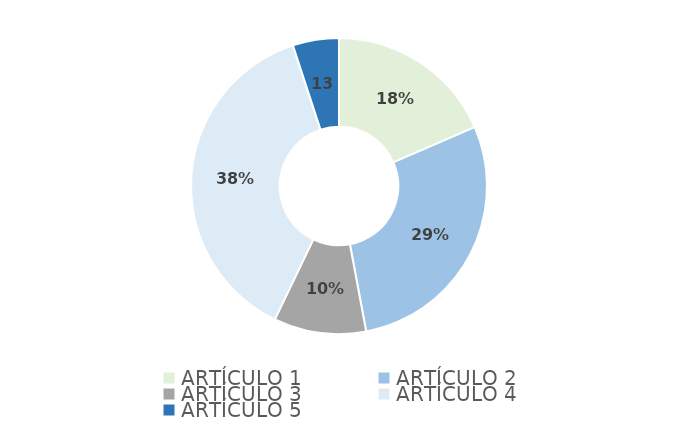
| Category | Series 0 |
|---|---|
| ARTÍCULO 1 | 22 |
| ARTÍCULO 2 | 34 |
| ARTÍCULO 3 | 12 |
| ARTÍCULO 4 | 45 |
| ARTÍCULO 5 | 6 |